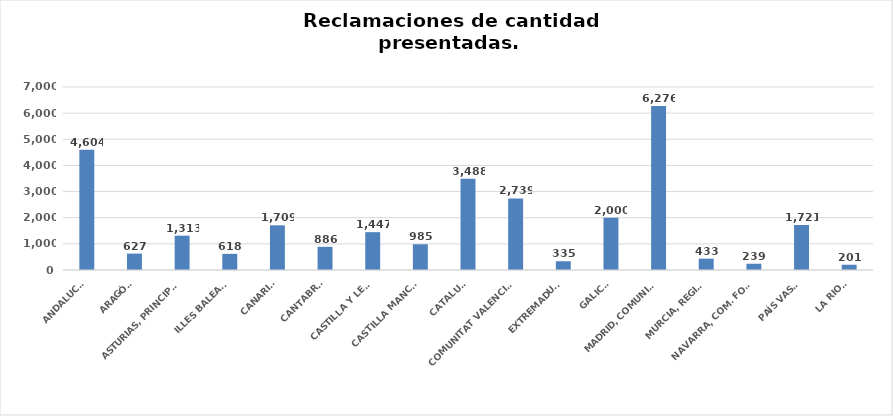
| Category | Series 0 |
|---|---|
| ANDALUCÍA | 4604 |
| ARAGÓN | 627 |
| ASTURIAS, PRINCIPADO | 1313 |
| ILLES BALEARS | 618 |
| CANARIAS | 1709 |
| CANTABRIA | 886 |
| CASTILLA Y LEÓN | 1447 |
| CASTILLA MANCHA | 985 |
| CATALUÑA | 3488 |
| COMUNITAT VALENCIANA | 2739 |
| EXTREMADURA | 335 |
| GALICIA | 2000 |
| MADRID, COMUNIDAD | 6276 |
| MURCIA, REGIÓN | 433 |
| NAVARRA, COM. FORAL | 239 |
| PAÍS VASCO | 1721 |
| LA RIOJA | 201 |